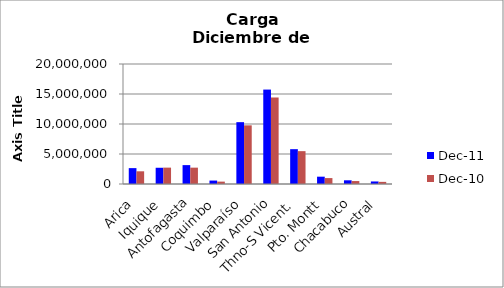
| Category | dic-11 | dic-10 |
|---|---|---|
| Arica | 2645121 | 2116548 |
| Iquique | 2706525.9 | 2729269.71 |
| Antofagasta | 3147118.951 | 2725187 |
| Coquimbo | 573377 | 396121 |
| Valparaíso | 10307182 | 9776361 |
| San Antonio | 15737395.03 | 14435471.74 |
| Thno-S Vicent. | 5804331.43 | 5474555.384 |
| Pto. Montt | 1219391 | 987012 |
| Chacabuco | 616378 | 490900 |
| Austral | 422759 | 356180.6 |